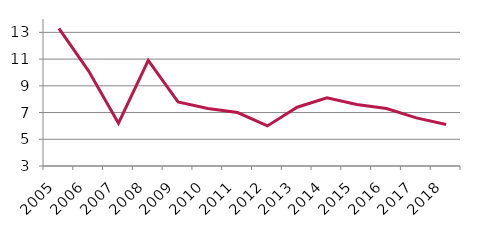
| Category | Rok | Hodnota |
|---|---|---|
| 2005.0 | 2005 | 13.3 |
| 2006.0 | 2006 | 10.1 |
| 2007.0 | 2007 | 6.2 |
| 2008.0 | 2008 | 10.9 |
| 2009.0 | 2009 | 7.8 |
| 2010.0 | 2010 | 7.3 |
| 2011.0 | 2011 | 7 |
| 2012.0 | 2012 | 6 |
| 2013.0 | 2013 | 7.4 |
| 2014.0 | 2014 | 8.1 |
| 2015.0 | 2015 | 7.6 |
| 2016.0 | 2016 | 7.3 |
| 2017.0 | 2017 | 6.6 |
| 2018.0 | 2018 | 6.1 |